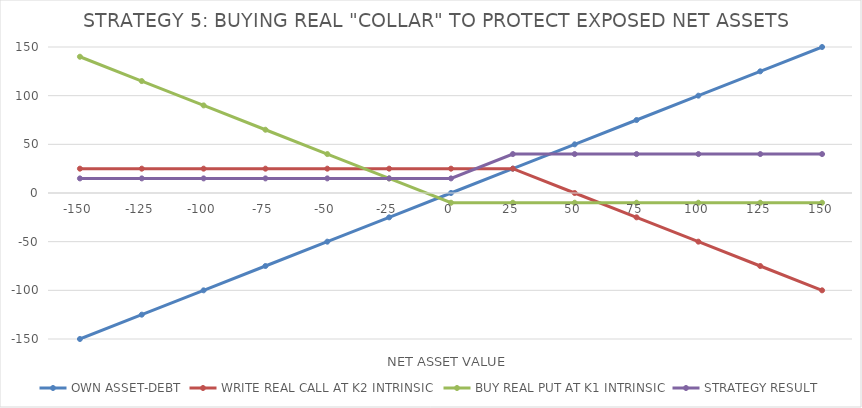
| Category | OWN ASSET-DEBT | WRITE REAL CALL AT K2 INTRINSIC  | BUY REAL PUT AT K1 INTRINSIC | STRATEGY RESULT |
|---|---|---|---|---|
| -150.0 | -150 | 25 | 140 | 15 |
| -125.0 | -125 | 25 | 115 | 15 |
| -100.0 | -100 | 25 | 90 | 15 |
| -75.0 | -75 | 25 | 65 | 15 |
| -50.0 | -50 | 25 | 40 | 15 |
| -25.0 | -25 | 25 | 15 | 15 |
| 0.0 | 0 | 25 | -10 | 15 |
| 25.0 | 25 | 25 | -10 | 40 |
| 50.0 | 50 | 0 | -10 | 40 |
| 75.0 | 75 | -25 | -10 | 40 |
| 100.0 | 100 | -50 | -10 | 40 |
| 125.0 | 125 | -75 | -10 | 40 |
| 150.0 | 150 | -100 | -10 | 40 |